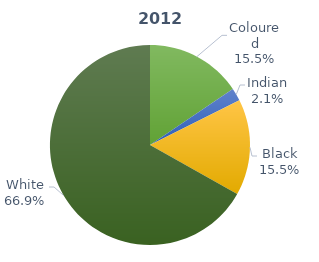
| Category | Series 0 |
|---|---|
| Coloured | 4319 |
| Indian | 579 |
| Black | 4323 |
| White | 18602 |